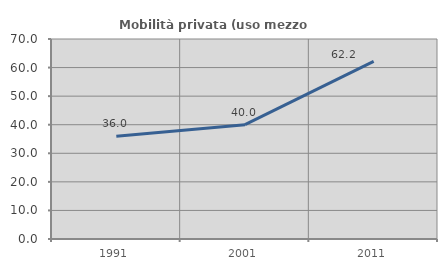
| Category | Mobilità privata (uso mezzo privato) |
|---|---|
| 1991.0 | 35.955 |
| 2001.0 | 40 |
| 2011.0 | 62.162 |